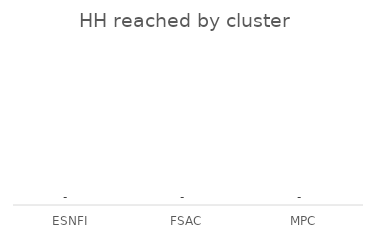
| Category | Series 0 |
|---|---|
| ESNFI | 0 |
| FSAC | 0 |
| MPC | 0 |